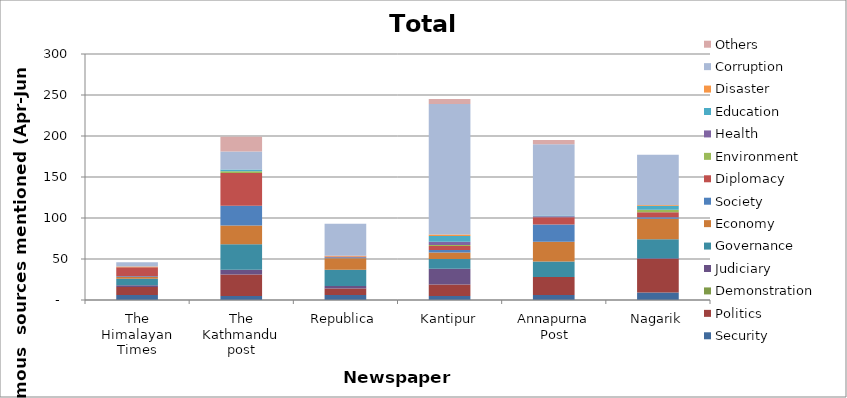
| Category | Security | Politics | Demonstration | Judiciary | Governance | Economy | Society | Diplomacy | Environment | Health | Education | Disaster | Corruption | Others |
|---|---|---|---|---|---|---|---|---|---|---|---|---|---|---|
| The Himalayan Times | 6 | 10 | 0 | 2 | 8 | 2 | 1 | 11 | 0 | 0 | 0 | 1 | 5 | 0 |
| The Kathmandu post | 5 | 26 | 0 | 6 | 31 | 23 | 24 | 40 | 2 | 0 | 2 | 0 | 22 | 18 |
| Republica | 6 | 8 | 0 | 3 | 20 | 14 | 1 | 1 | 0 | 0 | 0 | 1 | 39 | 0 |
| Kantipur | 5 | 14 | 0 | 19 | 12 | 8 | 3 | 5 | 1 | 4 | 7 | 2 | 159 | 6 |
| Annapurna Post | 6 | 22 | 0 | 0 | 19 | 24 | 21 | 9 | 0 | 1 | 1 | 0 | 87 | 5 |
| Nagarik | 9 | 41 | 0 | 1 | 23 | 25 | 2 | 6 | 3 | 0 | 5 | 1 | 61 | 0 |